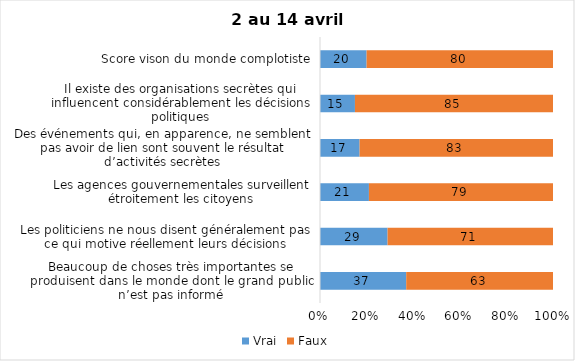
| Category | Vrai | Faux |
|---|---|---|
| Beaucoup de choses très importantes se produisent dans le monde dont le grand public n’est pas informé | 37 | 63 |
| Les politiciens ne nous disent généralement pas ce qui motive réellement leurs décisions | 29 | 71 |
| Les agences gouvernementales surveillent étroitement les citoyens | 21 | 79 |
| Des événements qui, en apparence, ne semblent pas avoir de lien sont souvent le résultat d’activités secrètes | 17 | 83 |
| Il existe des organisations secrètes qui influencent considérablement les décisions politiques | 15 | 85 |
| Score vison du monde complotiste | 20 | 80 |